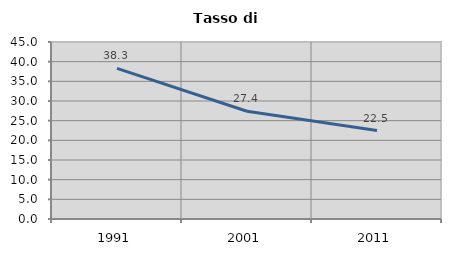
| Category | Tasso di disoccupazione   |
|---|---|
| 1991.0 | 38.275 |
| 2001.0 | 27.383 |
| 2011.0 | 22.497 |